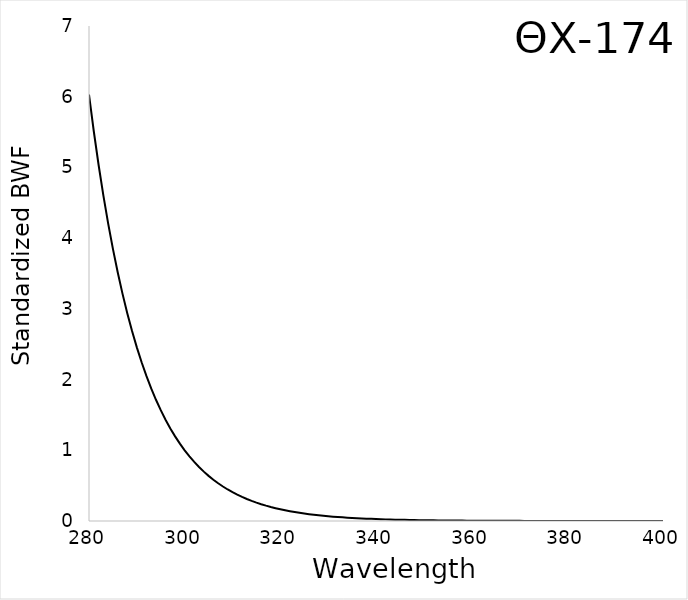
| Category | BWF |
|---|---|
| 280.0 | 6.03 |
| 281.0 | 5.512 |
| 282.0 | 5.038 |
| 283.0 | 4.605 |
| 284.0 | 4.21 |
| 285.0 | 3.848 |
| 286.0 | 3.517 |
| 287.0 | 3.215 |
| 288.0 | 2.939 |
| 289.0 | 2.686 |
| 290.0 | 2.456 |
| 291.0 | 2.245 |
| 292.0 | 2.052 |
| 293.0 | 1.875 |
| 294.0 | 1.714 |
| 295.0 | 1.567 |
| 296.0 | 1.432 |
| 297.0 | 1.309 |
| 298.0 | 1.197 |
| 299.0 | 1.094 |
| 300.0 | 1 |
| 301.0 | 0.914 |
| 302.0 | 0.836 |
| 303.0 | 0.764 |
| 304.0 | 0.698 |
| 305.0 | 0.638 |
| 306.0 | 0.583 |
| 307.0 | 0.533 |
| 308.0 | 0.487 |
| 309.0 | 0.446 |
| 310.0 | 0.407 |
| 311.0 | 0.372 |
| 312.0 | 0.34 |
| 313.0 | 0.311 |
| 314.0 | 0.284 |
| 315.0 | 0.26 |
| 316.0 | 0.238 |
| 317.0 | 0.217 |
| 318.0 | 0.198 |
| 319.0 | 0.181 |
| 320.0 | 0.166 |
| 321.0 | 0.152 |
| 322.0 | 0.139 |
| 323.0 | 0.127 |
| 324.0 | 0.116 |
| 325.0 | 0.106 |
| 326.0 | 0.097 |
| 327.0 | 0.088 |
| 328.0 | 0.081 |
| 329.0 | 0.074 |
| 330.0 | 0.068 |
| 331.0 | 0.062 |
| 332.0 | 0.056 |
| 333.0 | 0.052 |
| 334.0 | 0.047 |
| 335.0 | 0.043 |
| 336.0 | 0.039 |
| 337.0 | 0.036 |
| 338.0 | 0.033 |
| 339.0 | 0.03 |
| 340.0 | 0.028 |
| 341.0 | 0.025 |
| 342.0 | 0.023 |
| 343.0 | 0.021 |
| 344.0 | 0.019 |
| 345.0 | 0.018 |
| 346.0 | 0.016 |
| 347.0 | 0.015 |
| 348.0 | 0.013 |
| 349.0 | 0.012 |
| 350.0 | 0.011 |
| 351.0 | 0.01 |
| 352.0 | 0.009 |
| 353.0 | 0.009 |
| 354.0 | 0.008 |
| 355.0 | 0.007 |
| 356.0 | 0.007 |
| 357.0 | 0.006 |
| 358.0 | 0.005 |
| 359.0 | 0.005 |
| 360.0 | 0.005 |
| 361.0 | 0.004 |
| 362.0 | 0.004 |
| 363.0 | 0.003 |
| 364.0 | 0.003 |
| 365.0 | 0.003 |
| 366.0 | 0.003 |
| 367.0 | 0.002 |
| 368.0 | 0.002 |
| 369.0 | 0.002 |
| 370.0 | 0.002 |
| 371.0 | 0.002 |
| 372.0 | 0.002 |
| 373.0 | 0.001 |
| 374.0 | 0.001 |
| 375.0 | 0.001 |
| 376.0 | 0.001 |
| 377.0 | 0.001 |
| 378.0 | 0.001 |
| 379.0 | 0.001 |
| 380.0 | 0.001 |
| 381.0 | 0.001 |
| 382.0 | 0.001 |
| 383.0 | 0.001 |
| 384.0 | 0.001 |
| 385.0 | 0 |
| 386.0 | 0 |
| 387.0 | 0 |
| 388.0 | 0 |
| 389.0 | 0 |
| 390.0 | 0 |
| 391.0 | 0 |
| 392.0 | 0 |
| 393.0 | 0 |
| 394.0 | 0 |
| 395.0 | 0 |
| 396.0 | 0 |
| 397.0 | 0 |
| 398.0 | 0 |
| 399.0 | 0 |
| 400.0 | 0 |
| 401.0 | 0 |
| 402.0 | 0 |
| 403.0 | 0 |
| 404.0 | 0 |
| 405.0 | 0 |
| 406.0 | 0 |
| 407.0 | 0 |
| 408.0 | 0 |
| 409.0 | 0 |
| 410.0 | 0 |
| 411.0 | 0 |
| 412.0 | 0 |
| 413.0 | 0 |
| 414.0 | 0 |
| 415.0 | 0 |
| 416.0 | 0 |
| 417.0 | 0 |
| 418.0 | 0 |
| 419.0 | 0 |
| 420.0 | 0 |
| 421.0 | 0 |
| 422.0 | 0 |
| 423.0 | 0 |
| 424.0 | 0 |
| 425.0 | 0 |
| 426.0 | 0 |
| 427.0 | 0 |
| 428.0 | 0 |
| 429.0 | 0 |
| 430.0 | 0 |
| 431.0 | 0 |
| 432.0 | 0 |
| 433.0 | 0 |
| 434.0 | 0 |
| 435.0 | 0 |
| 436.0 | 0 |
| 437.0 | 0 |
| 438.0 | 0 |
| 439.0 | 0 |
| 440.0 | 0 |
| 441.0 | 0 |
| 442.0 | 0 |
| 443.0 | 0 |
| 444.0 | 0 |
| 445.0 | 0 |
| 446.0 | 0 |
| 447.0 | 0 |
| 448.0 | 0 |
| 449.0 | 0 |
| 450.0 | 0 |
| 451.0 | 0 |
| 452.0 | 0 |
| 453.0 | 0 |
| 454.0 | 0 |
| 455.0 | 0 |
| 456.0 | 0 |
| 457.0 | 0 |
| 458.0 | 0 |
| 459.0 | 0 |
| 460.0 | 0 |
| 461.0 | 0 |
| 462.0 | 0 |
| 463.0 | 0 |
| 464.0 | 0 |
| 465.0 | 0 |
| 466.0 | 0 |
| 467.0 | 0 |
| 468.0 | 0 |
| 469.0 | 0 |
| 470.0 | 0 |
| 471.0 | 0 |
| 472.0 | 0 |
| 473.0 | 0 |
| 474.0 | 0 |
| 475.0 | 0 |
| 476.0 | 0 |
| 477.0 | 0 |
| 478.0 | 0 |
| 479.0 | 0 |
| 480.0 | 0 |
| 481.0 | 0 |
| 482.0 | 0 |
| 483.0 | 0 |
| 484.0 | 0 |
| 485.0 | 0 |
| 486.0 | 0 |
| 487.0 | 0 |
| 488.0 | 0 |
| 489.0 | 0 |
| 490.0 | 0 |
| 491.0 | 0 |
| 492.0 | 0 |
| 493.0 | 0 |
| 494.0 | 0 |
| 495.0 | 0 |
| 496.0 | 0 |
| 497.0 | 0 |
| 498.0 | 0 |
| 499.0 | 0 |
| 500.0 | 0 |